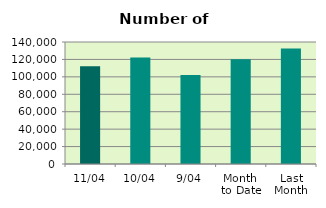
| Category | Series 0 |
|---|---|
| 11/04 | 112054 |
| 10/04 | 122198 |
| 9/04 | 102008 |
| Month 
to Date | 120216.889 |
| Last
Month | 132498.571 |